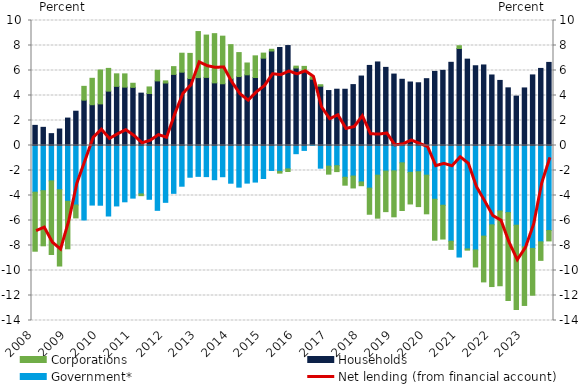
| Category | Government* | Households | Corporations |
|---|---|---|---|
| 2008.0 | -3.735 | 1.61 | -4.722 |
| nan | -3.615 | 1.453 | -4.409 |
| nan | -2.831 | 0.949 | -5.891 |
| nan | -3.539 | 1.318 | -6.102 |
| 2009.0 | -4.467 | 2.194 | -3.796 |
| nan | -4.761 | 2.742 | -1.033 |
| nan | -5.958 | 3.627 | 1.106 |
| nan | -4.765 | 3.263 | 2.113 |
| 2010.0 | -4.778 | 3.33 | 2.714 |
| nan | -5.641 | 4.349 | 1.819 |
| nan | -4.835 | 4.732 | 1.002 |
| nan | -4.504 | 4.67 | 1.06 |
| 2011.0 | -4.21 | 4.651 | 0.328 |
| nan | -3.873 | 4.189 | -0.139 |
| nan | -4.302 | 4.16 | 0.525 |
| nan | -5.187 | 5.168 | 0.851 |
| 2012.0 | -4.547 | 4.999 | 0.17 |
| nan | -3.828 | 5.688 | 0.622 |
| nan | -3.257 | 5.866 | 1.517 |
| nan | -2.538 | 5.357 | 2.012 |
| 2013.0 | -2.468 | 5.433 | 3.683 |
| nan | -2.49 | 5.449 | 3.384 |
| nan | -2.736 | 5.011 | 3.937 |
| nan | -2.498 | 4.939 | 3.808 |
| 2014.0 | -3.016 | 5.335 | 2.734 |
| nan | -3.33 | 5.516 | 1.917 |
| nan | -3.009 | 5.654 | 0.947 |
| nan | -2.926 | 5.438 | 1.734 |
| 2015.0 | -2.638 | 6.988 | 0.405 |
| nan | -1.997 | 7.561 | 0.138 |
| nan | -2.069 | 7.838 | -0.14 |
| nan | -1.87 | 7.996 | -0.208 |
| 2016.0 | -0.655 | 6.199 | 0.15 |
| nan | -0.393 | 5.969 | 0.361 |
| nan | 0.088 | 5.216 | 0.194 |
| nan | -1.815 | 4.746 | 0.116 |
| 2017.0 | -1.653 | 4.396 | -0.637 |
| nan | -1.614 | 4.503 | -0.475 |
| nan | -2.541 | 4.5 | -0.633 |
| nan | -2.444 | 4.872 | -0.952 |
| 2018.0 | -2.915 | 5.556 | -0.3 |
| nan | -3.411 | 6.405 | -2.089 |
| nan | -2.373 | 6.683 | -3.439 |
| nan | -2.046 | 6.25 | -3.244 |
| 2019.0 | -2.027 | 5.715 | -3.679 |
| nan | -1.388 | 5.297 | -3.814 |
| nan | -2.149 | 5.079 | -2.528 |
| nan | -2.098 | 5.018 | -2.789 |
| 2020.0 | -2.373 | 5.346 | -3.092 |
| nan | -4.302 | 5.928 | -3.274 |
| nan | -4.78 | 6.011 | -2.703 |
| nan | -7.655 | 6.656 | -0.657 |
| 2021.0 | -8.922 | 7.76 | 0.222 |
| nan | -8.276 | 6.909 | -0.095 |
| nan | -8.357 | 6.38 | -1.362 |
| nan | -7.252 | 6.443 | -3.66 |
| 2022.0 | -6.346 | 5.641 | -4.939 |
| nan | -5.241 | 5.206 | -5.979 |
| nan | -5.367 | 4.612 | -7.033 |
| nan | -6.376 | 3.951 | -6.744 |
| 2023.0 | -8.111 | 4.605 | -4.685 |
| nan | -8.235 | 5.647 | -3.743 |
| nan | -7.707 | 6.166 | -1.482 |
| nan | -6.803 | 6.647 | -0.83 |